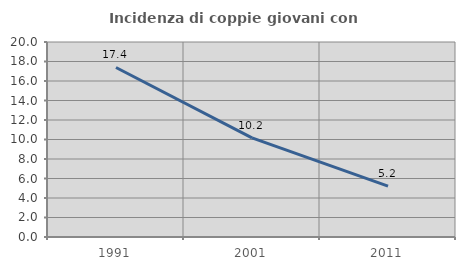
| Category | Incidenza di coppie giovani con figli |
|---|---|
| 1991.0 | 17.385 |
| 2001.0 | 10.167 |
| 2011.0 | 5.219 |